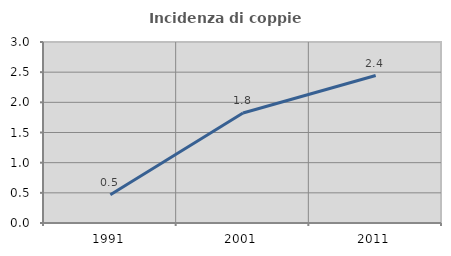
| Category | Incidenza di coppie miste |
|---|---|
| 1991.0 | 0.468 |
| 2001.0 | 1.823 |
| 2011.0 | 2.445 |